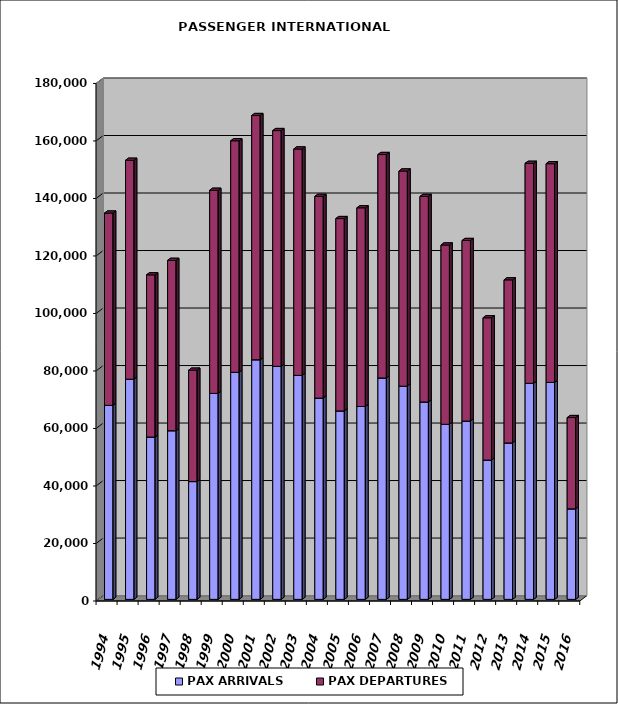
| Category | PAX ARRIVALS | PAX DEPARTURES |
|---|---|---|
| 1994.0 | 67481 | 66863 |
| 1995.0 | 76576 | 76126 |
| 1996.0 | 56456 | 56409 |
| 1997.0 | 58654 | 59244 |
| 1998.0 | 40969 | 38739 |
| 1999.0 | 71636 | 70632 |
| 2000.0 | 78965 | 80529 |
| 2001.0 | 83331 | 84936 |
| 2002.0 | 81045 | 81994 |
| 2003.0 | 77903 | 78735 |
| 2004.0 | 69995 | 70158 |
| 2005.0 | 65542 | 66893 |
| 2006.0 | 67078 | 69097 |
| 2007.0 | 77004 | 77704 |
| 2008.0 | 74151 | 74824 |
| 2009.0 | 68655 | 71480 |
| 2010.0 | 60882 | 62358 |
| 2011.0 | 62008 | 62792 |
| 2012.0 | 48435 | 49499 |
| 2013.0 | 54395 | 56724 |
| 2014.0 | 75139 | 76503 |
| 2015.0 | 75475 | 76049 |
| 2016.0 | 31480 | 31746 |